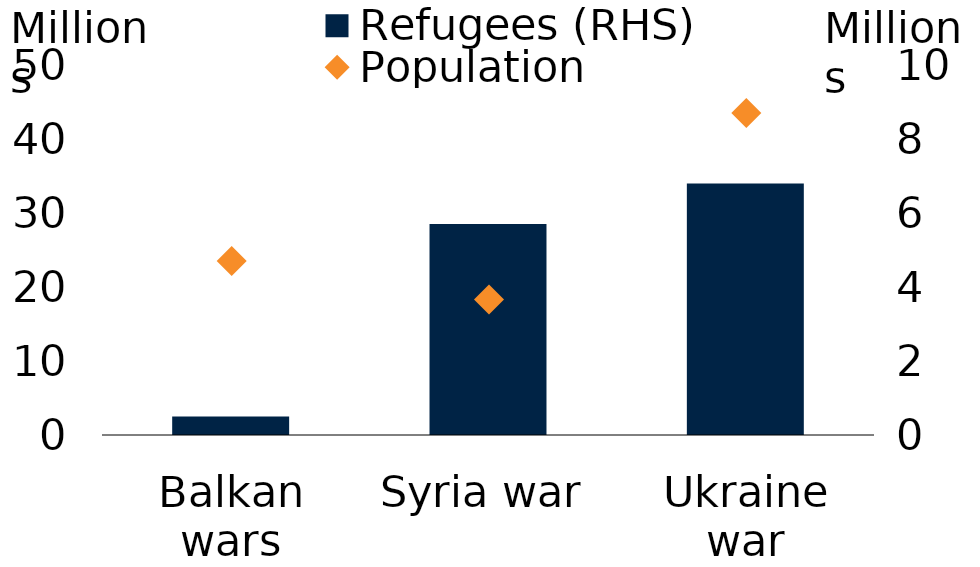
| Category | Refugees (RHS) |
|---|---|
| Balkan wars | 0.5 |
| Syria war | 5.7 |
| Ukraine war | 6.8 |